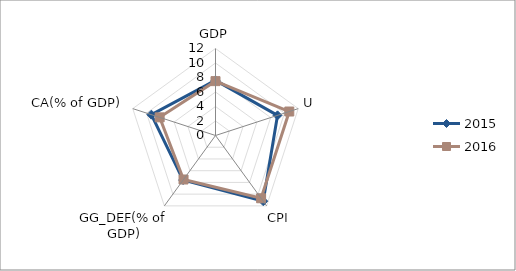
| Category | 2015 | 2016 |
|---|---|---|
| GDP | 7.6 | 7.5 |
| U | 8.996 | 10.702 |
| CPI | 11.2 | 10.7 |
| GG_DEF(% of GDP) | 7.6 | 7.5 |
| CA(% of GDP) | 9.3 | 8.1 |